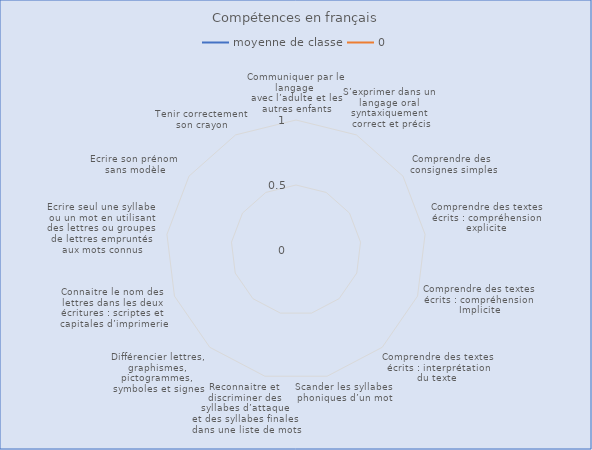
| Category | moyenne de classe | 0 |
|---|---|---|
| Communiquer par le langage 
avec l’adulte et les autres enfants | 0 |  |
| S’exprimer dans un 
langage oral 
syntaxiquement 
correct et précis | 0 |  |
| Comprendre des 
consignes simples | 0 |  |
| Comprendre des textes 
écrits : compréhension 
explicite  | 0 |  |
| Comprendre des textes 
écrits : compréhension 
Implicite | 0 |  |
| Comprendre des textes 
écrits : interprétation 
du texte  | 0 |  |
| Scander les syllabes 
phoniques d’un mot | 0 |  |
| Reconnaitre et 
discriminer des 
syllabes d’attaque 
et des syllabes finales 
dans une liste de mots | 0 |  |
| Différencier lettres, 
graphismes, 
pictogrammes, 
symboles et signes | 0 |  |
| Connaitre le nom des 
lettres dans les deux 
écritures : scriptes et 
capitales d’imprimerie | 0 |  |
| Ecrire seul une syllabe 
ou un mot en utilisant 
des lettres ou groupes 
de lettres empruntés 
aux mots connus | 0 |  |
| Ecrire son prénom 
sans modèle | 0 |  |
| Tenir correctement 
son crayon | 0 |  |